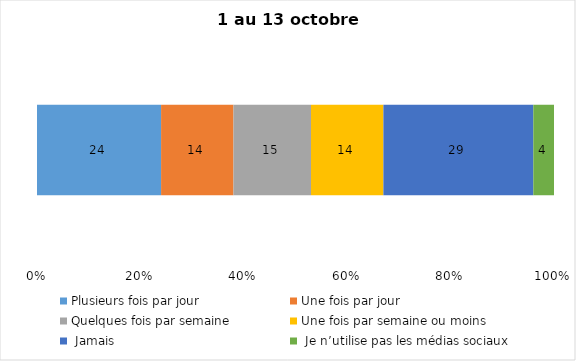
| Category | Plusieurs fois par jour | Une fois par jour | Quelques fois par semaine   | Une fois par semaine ou moins   |  Jamais   |  Je n’utilise pas les médias sociaux |
|---|---|---|---|---|---|---|
| 0 | 24 | 14 | 15 | 14 | 29 | 4 |